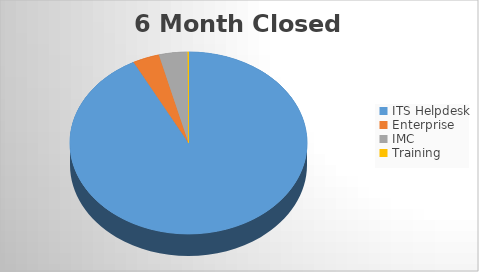
| Category | 6M Closed | 6M Opened |
|---|---|---|
| ITS Helpdesk | 3370 | 1973 |
| Enterprise | 133 | 15 |
| IMC | 142 | 58 |
| Training | 5 | 3 |